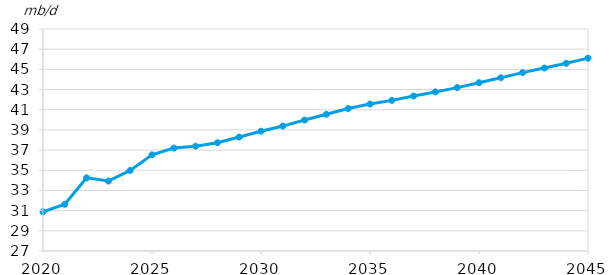
| Category | OPEC total liquids supply |
|---|---|
| 2020-01-01 | 30.89 |
| 2021-01-01 | 31.63 |
| 2022-01-01 | 34.249 |
| 2023-01-01 | 33.933 |
| 2024-01-01 | 34.988 |
| 2025-01-01 | 36.532 |
| 2026-01-01 | 37.201 |
| 2027-01-01 | 37.387 |
| 2028-01-01 | 37.727 |
| 2029-01-01 | 38.291 |
| 2030-01-01 | 38.872 |
| 2031-01-01 | 39.38 |
| 2032-01-01 | 39.978 |
| 2033-01-01 | 40.549 |
| 2034-01-01 | 41.122 |
| 2035-01-01 | 41.561 |
| 2036-01-01 | 41.928 |
| 2037-01-01 | 42.358 |
| 2038-01-01 | 42.765 |
| 2039-01-01 | 43.191 |
| 2040-01-01 | 43.681 |
| 2041-01-01 | 44.17 |
| 2042-01-01 | 44.677 |
| 2043-01-01 | 45.13 |
| 2044-01-01 | 45.599 |
| 2045-01-01 | 46.105 |